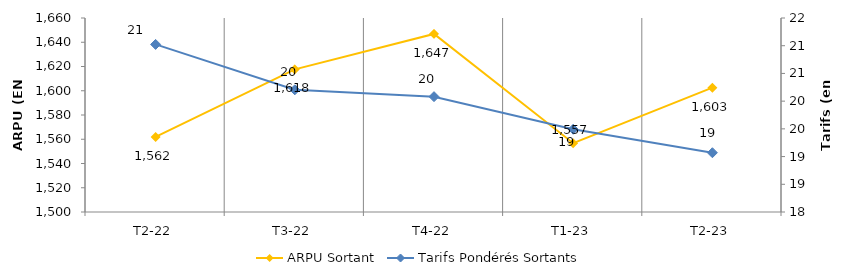
| Category | ARPU Sortant |
|---|---|
| T2-22 | 1561.879 |
| T3-22 | 1617.612 |
| T4-22 | 1646.839 |
| T1-23 | 1556.725 |
| T2-23 | 1602.522 |